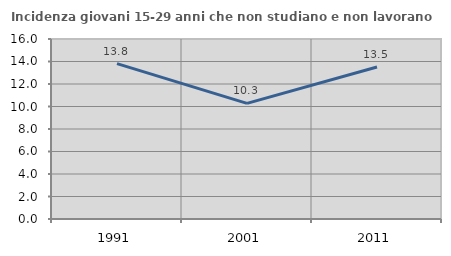
| Category | Incidenza giovani 15-29 anni che non studiano e non lavorano  |
|---|---|
| 1991.0 | 13.805 |
| 2001.0 | 10.274 |
| 2011.0 | 13.51 |